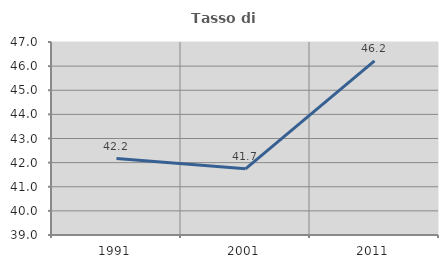
| Category | Tasso di occupazione   |
|---|---|
| 1991.0 | 42.169 |
| 2001.0 | 41.745 |
| 2011.0 | 46.22 |